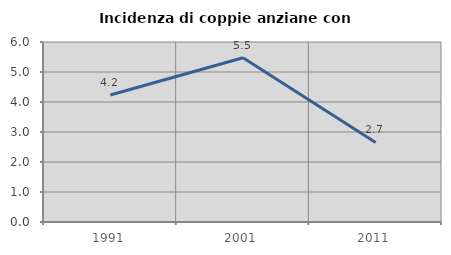
| Category | Incidenza di coppie anziane con figli |
|---|---|
| 1991.0 | 4.232 |
| 2001.0 | 5.476 |
| 2011.0 | 2.651 |